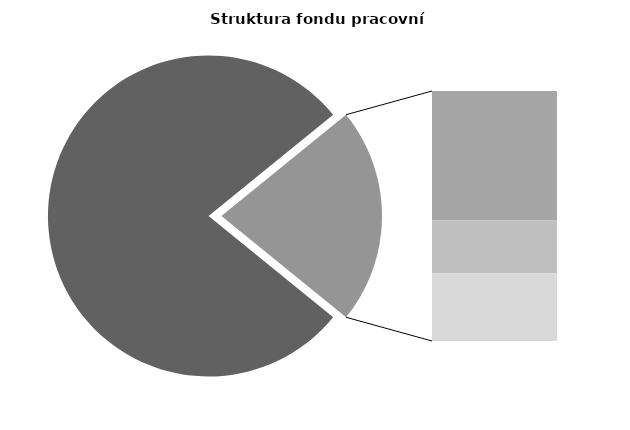
| Category | Series 0 |
|---|---|
| Průměrná měsíční odpracovaná doba bez přesčasu | 134.568 |
| Dovolená | 19.316 |
| Nemoc | 7.923 |
| Jiné | 10.105 |